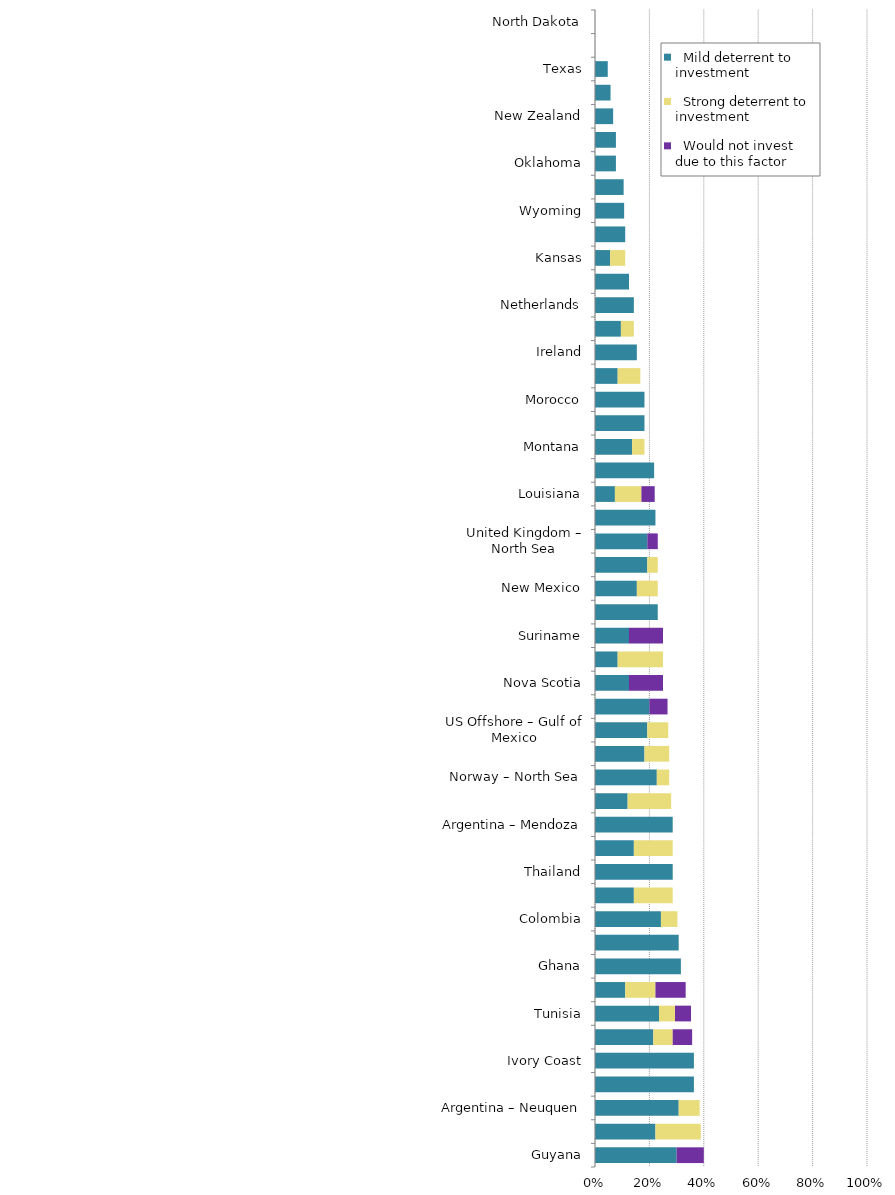
| Category |   Mild deterrent to investment |   Strong deterrent to investment |   Would not invest due to this factor |
|---|---|---|---|
| Guyana | 0.3 | 0 | 0.1 |
| United Arab Emirates | 0.222 | 0.167 | 0 |
| Argentina – Neuquen | 0.308 | 0.077 | 0 |
| Alabama | 0.364 | 0 | 0 |
| Ivory Coast | 0.364 | 0 | 0 |
| Myanmar | 0.214 | 0.071 | 0.071 |
| Tunisia | 0.235 | 0.059 | 0.059 |
| Alaska | 0.111 | 0.111 | 0.111 |
| Ghana | 0.316 | 0 | 0 |
| Oman | 0.308 | 0 | 0 |
| Colombia | 0.242 | 0.061 | 0 |
| Spain – Offshore | 0.143 | 0.143 | 0 |
| Thailand | 0.286 | 0 | 0 |
| Mozambique | 0.143 | 0.143 | 0 |
| Argentina – Mendoza | 0.286 | 0 | 0 |
| Australia – Offshore | 0.12 | 0.16 | 0 |
| Norway – North Sea | 0.227 | 0.045 | 0 |
| Romania | 0.182 | 0.091 | 0 |
| US Offshore – Gulf of Mexico | 0.192 | 0.077 | 0 |
| UK – Other Offshore (ex. Nth. Sea) | 0.2 | 0 | 0.067 |
| Nova Scotia | 0.125 | 0 | 0.125 |
| Queensland | 0.083 | 0.167 | 0 |
| Suriname | 0.125 | 0 | 0.125 |
| Arkansas | 0.231 | 0 | 0 |
| New Mexico | 0.154 | 0.077 | 0 |
| Western Australia | 0.192 | 0.038 | 0 |
| United Kingdom – North Sea | 0.192 | 0 | 0.038 |
| Norway – Other Offshore (ex. Nth. Sea) | 0.222 | 0 | 0 |
| Louisiana | 0.073 | 0.098 | 0.049 |
| Peru | 0.217 | 0 | 0 |
| Montana | 0.136 | 0.045 | 0 |
| Utah | 0.182 | 0 | 0 |
| Morocco | 0.182 | 0 | 0 |
| Namibia | 0.083 | 0.083 | 0 |
| Ireland | 0.154 | 0 | 0 |
| South Australia | 0.095 | 0.048 | 0 |
| Netherlands | 0.143 | 0 | 0 |
| Manitoba | 0.125 | 0 | 0 |
| Kansas | 0.056 | 0.056 | 0 |
| Poland | 0.111 | 0 | 0 |
| Wyoming | 0.107 | 0 | 0 |
| Mississippi | 0.105 | 0 | 0 |
| Oklahoma | 0.077 | 0 | 0 |
| West Virginia | 0.077 | 0 | 0 |
| New Zealand | 0.067 | 0 | 0 |
| Saskatchewan | 0.057 | 0 | 0 |
| Texas | 0.047 | 0 | 0 |
| Newfoundland & Labrador | 0 | 0 | 0 |
| North Dakota | 0 | 0 | 0 |